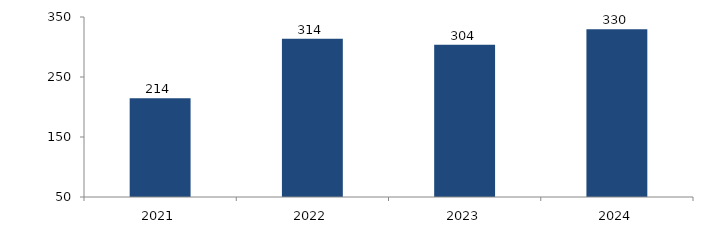
| Category | Bogotá |
|---|---|
| 2021.0 | 214.457 |
| 2022.0 | 313.897 |
| 2023.0 | 303.827 |
| 2024.0 | 329.572 |